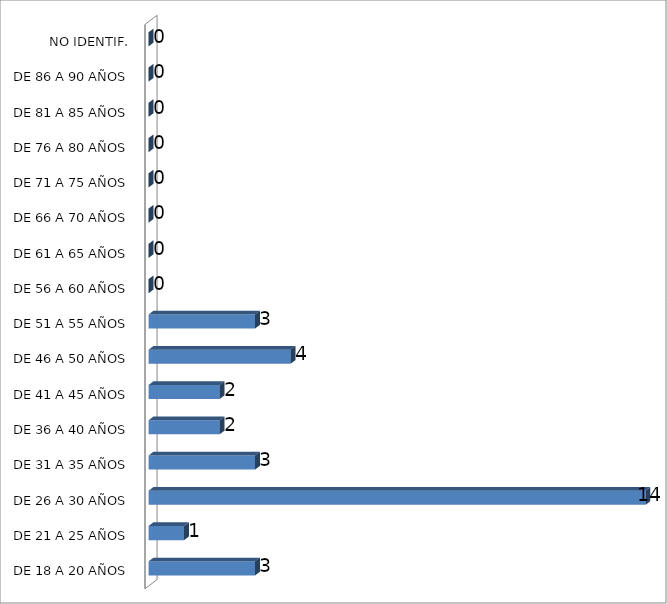
| Category | ESTADO  DE EBRIEDAD |
|---|---|
| DE 18 A 20 AÑOS | 3 |
| DE 21 A 25 AÑOS | 1 |
| DE 26 A 30 AÑOS | 14 |
| DE 31 A 35 AÑOS | 3 |
| DE 36 A 40 AÑOS | 2 |
| DE 41 A 45 AÑOS | 2 |
| DE 46 A 50 AÑOS | 4 |
| DE 51 A 55 AÑOS | 3 |
| DE 56 A 60 AÑOS | 0 |
| DE 61 A 65 AÑOS | 0 |
| DE 66 A 70 AÑOS | 0 |
| DE 71 A 75 AÑOS | 0 |
| DE 76 A 80 AÑOS | 0 |
| DE 81 A 85 AÑOS | 0 |
| DE 86 A 90 AÑOS | 0 |
| NO IDENTIF. | 0 |